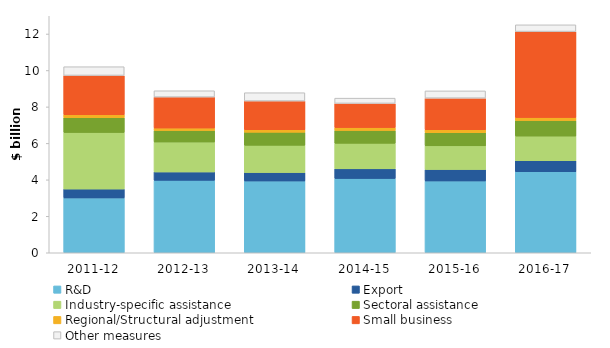
| Category | R&D | Export | Industry-specific assistance | Sectoral assistance | Regional/Structural adjustment | Small business | Other measures |
|---|---|---|---|---|---|---|---|
| 2011-12 | 3.009 | 0.487 | 3.102 | 0.808 | 0.168 | 2.152 | 0.48 |
| 2012-13 | 3.972 | 0.464 | 1.638 | 0.633 | 0.135 | 1.698 | 0.347 |
| 2013-14 | 3.938 | 0.462 | 1.496 | 0.712 | 0.142 | 1.572 | 0.457 |
| 2014-15 | 4.075 | 0.528 | 1.4 | 0.705 | 0.159 | 1.325 | 0.289 |
| 2015-16 | 3.94 | 0.627 | 1.299 | 0.719 | 0.161 | 1.735 | 0.398 |
| 2016-17 | 4.444 | 0.606 | 1.35 | 0.854 | 0.165 | 4.715 | 0.37 |